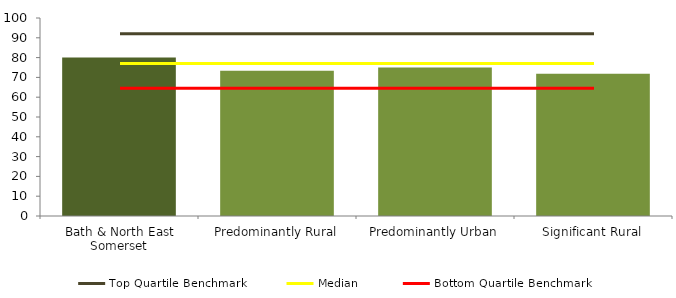
| Category | Series 0 |
|---|---|
| Bath & North East Somerset | 80 |
| Predominantly Rural | 73.4 |
| Predominantly Urban | 74.973 |
| Significant Rural | 71.875 |